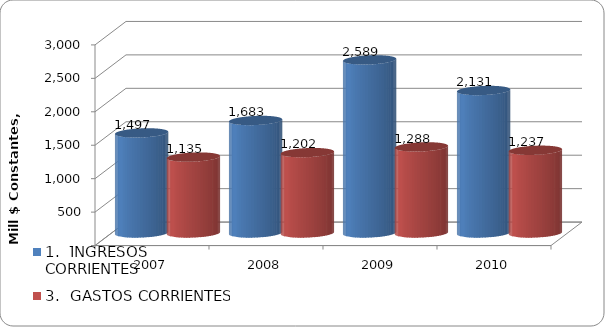
| Category | 1.  INGRESOS CORRIENTES | 3.  GASTOS CORRIENTES |
|---|---|---|
| 2007 | 1496.756 | 1135.314 |
| 2008 | 1682.682 | 1201.765 |
| 2009 | 2588.535 | 1287.562 |
| 2010 | 2131 | 1237 |